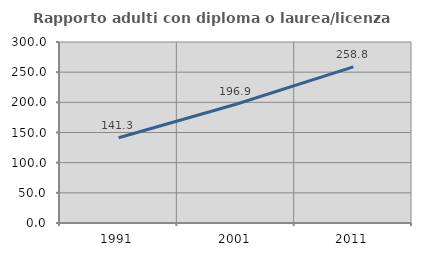
| Category | Rapporto adulti con diploma o laurea/licenza media  |
|---|---|
| 1991.0 | 141.259 |
| 2001.0 | 196.884 |
| 2011.0 | 258.789 |